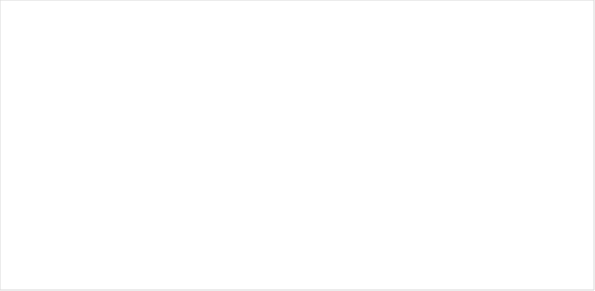
| Category | RESERVAS CONSTITUIDAS
 | CANCELACIONES RESERVAS PRESUPUESTALES
  | PAGOS
ACUMULADOS
 |
|---|---|---|---|
| A-FUNCIONAMIENTO | 2249.649 | 0 | 2233.009 |
| C-INVERSIÓN | 53197.266 | 1008.219 | 41533.215 |